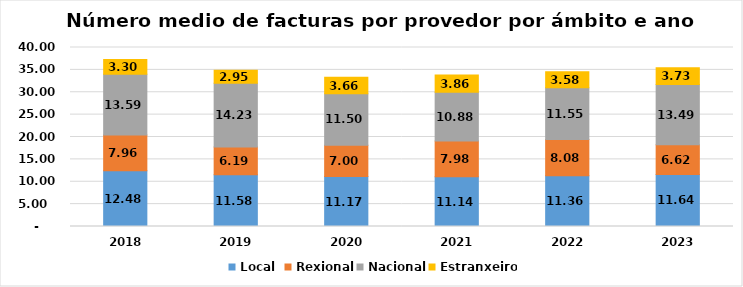
| Category | Local  | Rexional | Nacional | Estranxeiro |
|---|---|---|---|---|
| 2018.0 | 12.478 | 7.958 | 13.589 | 3.3 |
| 2019.0 | 11.575 | 6.186 | 14.229 | 2.946 |
| 2020.0 | 11.173 | 7 | 11.504 | 3.658 |
| 2021.0 | 11.14 | 7.98 | 10.88 | 3.86 |
| 2022.0 | 11.357 | 8.076 | 11.549 | 3.576 |
| 2023.0 | 11.637 | 6.619 | 13.488 | 3.734 |